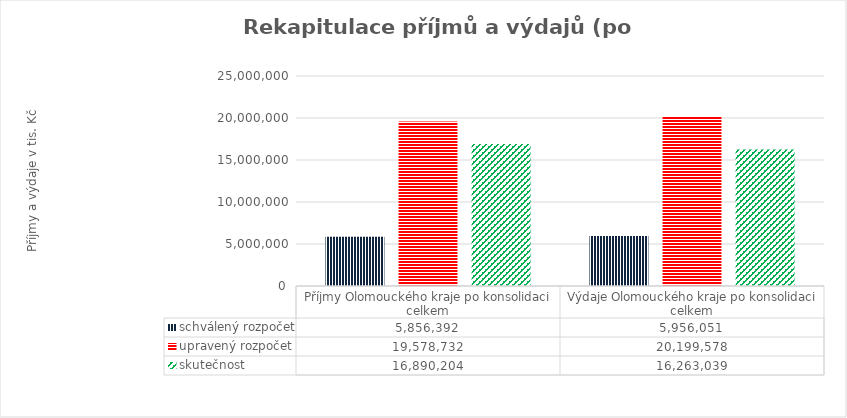
| Category | schválený rozpočet | upravený rozpočet | skutečnost |
|---|---|---|---|
| Příjmy Olomouckého kraje po konsolidaci celkem | 5856392 | 19578732 | 16890204 |
| Výdaje Olomouckého kraje po konsolidaci celkem | 5956051 | 20199578 | 16263039 |